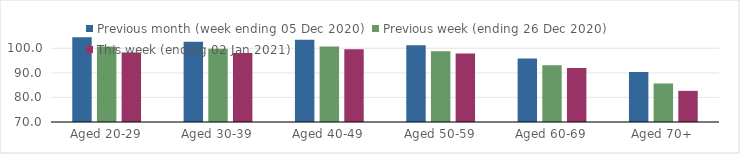
| Category | Previous month (week ending 05 Dec 2020) | Previous week (ending 26 Dec 2020) | This week (ending 02 Jan 2021) |
|---|---|---|---|
| Aged 20-29 | 104.52 | 100.69 | 98.24 |
| Aged 30-39 | 102.67 | 99.78 | 98.12 |
| Aged 40-49 | 103.45 | 100.77 | 99.56 |
| Aged 50-59 | 101.26 | 98.77 | 97.86 |
| Aged 60-69 | 95.8 | 93.1 | 91.97 |
| Aged 70+ | 90.34 | 85.69 | 82.68 |